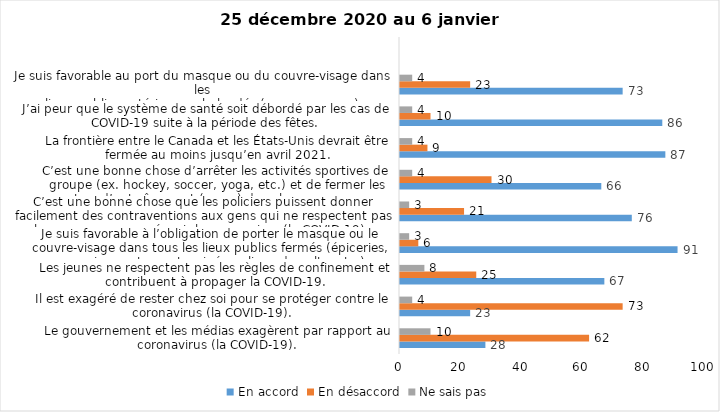
| Category | En accord | En désaccord | Ne sais pas |
|---|---|---|---|
| Le gouvernement et les médias exagèrent par rapport au coronavirus (la COVID-19). | 28 | 62 | 10 |
| Il est exagéré de rester chez soi pour se protéger contre le coronavirus (la COVID-19). | 23 | 73 | 4 |
| Les jeunes ne respectent pas les règles de confinement et contribuent à propager la COVID-19. | 67 | 25 | 8 |
| Je suis favorable à l’obligation de porter le masque ou le couvre-visage dans tous les lieux publics fermés (épiceries, magasins, restaurants, cinéma, lieux de culte, etc.). | 91 | 6 | 3 |
| C’est une bonne chose que les policiers puissent donner facilement des contraventions aux gens qui ne respectent pas les mesures pour prévenir le coronavirus (la COVID-19). | 76 | 21 | 3 |
| C’est une bonne chose d’arrêter les activités sportives de groupe (ex. hockey, soccer, yoga, etc.) et de fermer les centres d’entraînement (gyms) dans les zones rouges. | 66 | 30 | 4 |
| La frontière entre le Canada et les États-Unis devrait être fermée au moins jusqu’en avril 2021. | 87 | 9 | 4 |
| J’ai peur que le système de santé soit débordé par les cas de COVID-19 suite à la période des fêtes. | 86 | 10 | 4 |
| Je suis favorable au port du masque ou du couvre-visage dans les
lieux publics extérieurs achalandés (ex. rues, parcs) | 73 | 23 | 4 |